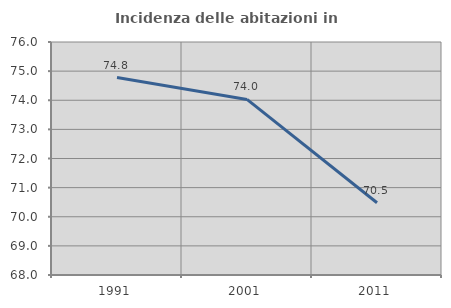
| Category | Incidenza delle abitazioni in proprietà  |
|---|---|
| 1991.0 | 74.78 |
| 2001.0 | 74.028 |
| 2011.0 | 70.481 |